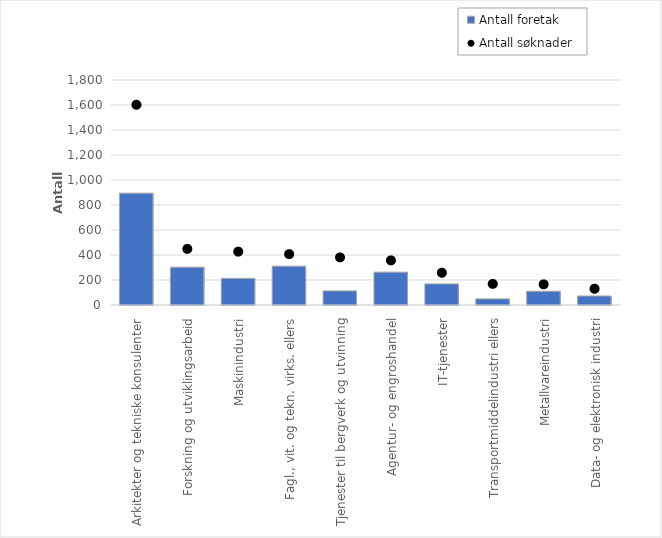
| Category | Antall foretak |
|---|---|
| Arkitekter og tekniske konsulenter | 895 |
| Forskning og utviklingsarbeid | 303 |
| Maskinindustri | 213 |
| Fagl., vit. og tekn. virks. ellers | 311 |
| Tjenester til bergverk og utvinning | 113 |
| Agentur- og engroshandel | 263 |
| IT-tjenester | 169 |
| Transportmiddelindustri ellers | 49 |
| Metallvareindustri | 110 |
| Data- og elektronisk industri | 72 |